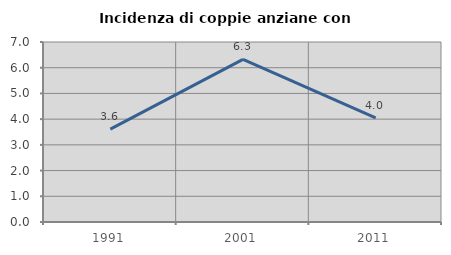
| Category | Incidenza di coppie anziane con figli |
|---|---|
| 1991.0 | 3.614 |
| 2001.0 | 6.322 |
| 2011.0 | 4.046 |